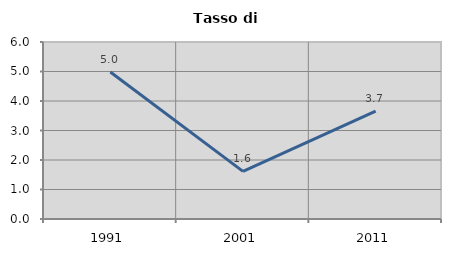
| Category | Tasso di disoccupazione   |
|---|---|
| 1991.0 | 4.984 |
| 2001.0 | 1.613 |
| 2011.0 | 3.659 |